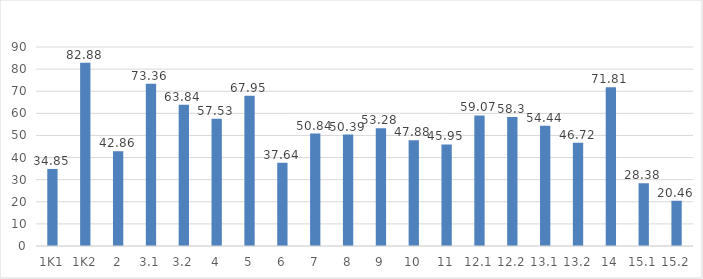
| Category | Камышловский муниципальный район |
|---|---|
| 1K1 | 34.85 |
| 1K2 | 82.88 |
| 2 | 42.86 |
| 3,1 | 73.36 |
| 3,2 | 63.84 |
| 4 | 57.53 |
| 5 | 67.95 |
| 6 | 37.64 |
| 7 | 50.84 |
| 8 | 50.39 |
| 9 | 53.28 |
| 10 | 47.88 |
| 11 | 45.95 |
| 12,1 | 59.07 |
| 12,2 | 58.3 |
| 13,1 | 54.44 |
| 13,2 | 46.72 |
| 14 | 71.81 |
| 15,1 | 28.38 |
| 15,2 | 20.46 |